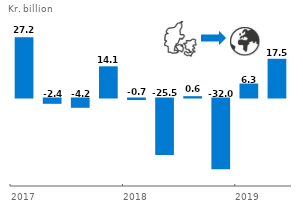
| Category | Series 0 |
|---|---|
| 2017.0 | 27.2 |
| 2017.0 | -2.4 |
| 2017.0 | -4.2 |
| 2017.0 | 14.1 |
| 2018.0 | -0.7 |
| 2018.0 | -25.5 |
| 2018.0 | 0.6 |
| 2018.0 | -32 |
| 2019.0 | 6.3 |
| 2019.0 | 17.5 |